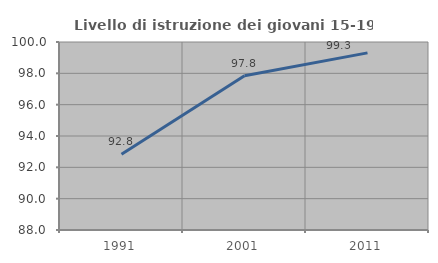
| Category | Livello di istruzione dei giovani 15-19 anni |
|---|---|
| 1991.0 | 92.84 |
| 2001.0 | 97.842 |
| 2011.0 | 99.306 |